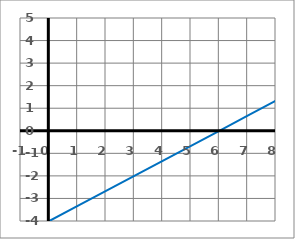
| Category | y |
|---|---|
| -1.0 | -4.667 |
| 0.0 | -4 |
| 1.0 | -3.333 |
| 2.0 | -2.667 |
| 3.0 | -2 |
| 4.0 | -1.333 |
| 5.0 | -0.667 |
| 6.0 | 0 |
| 7.0 | 0.667 |
| 8.0 | 1.333 |